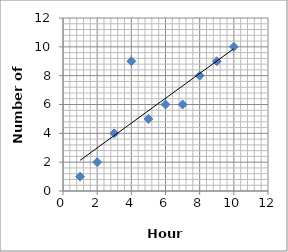
| Category | Series 0 |
|---|---|
| 1.0 | 1 |
| 2.0 | 2 |
| 3.0 | 4 |
| 4.0 | 9 |
| 5.0 | 5 |
| 6.0 | 6 |
| 7.0 | 6 |
| 8.0 | 8 |
| 9.0 | 9 |
| 10.0 | 10 |